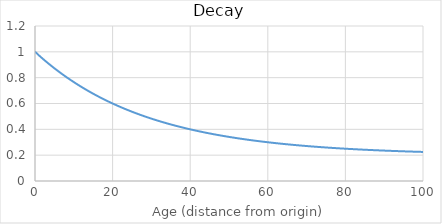
| Category | Decay |
|---|---|
| -2.0 | 1 |
| -1.0 | 1 |
| 0.0 | 1 |
| 1.0 | 0.973 |
| 2.0 | 0.946 |
| 3.0 | 0.921 |
| 4.0 | 0.896 |
| 5.0 | 0.873 |
| 6.0 | 0.85 |
| 7.0 | 0.828 |
| 8.0 | 0.806 |
| 9.0 | 0.786 |
| 10.0 | 0.766 |
| 11.0 | 0.746 |
| 12.0 | 0.728 |
| 13.0 | 0.71 |
| 14.0 | 0.692 |
| 15.0 | 0.676 |
| 16.0 | 0.659 |
| 17.0 | 0.644 |
| 18.0 | 0.629 |
| 19.0 | 0.614 |
| 20.0 | 0.6 |
| 21.0 | 0.586 |
| 22.0 | 0.573 |
| 23.0 | 0.561 |
| 24.0 | 0.548 |
| 25.0 | 0.536 |
| 26.0 | 0.525 |
| 27.0 | 0.514 |
| 28.0 | 0.503 |
| 29.0 | 0.493 |
| 30.0 | 0.483 |
| 31.0 | 0.473 |
| 32.0 | 0.464 |
| 33.0 | 0.455 |
| 34.0 | 0.446 |
| 35.0 | 0.438 |
| 36.0 | 0.43 |
| 37.0 | 0.422 |
| 38.0 | 0.414 |
| 39.0 | 0.407 |
| 40.0 | 0.4 |
| 41.0 | 0.393 |
| 42.0 | 0.387 |
| 43.0 | 0.38 |
| 44.0 | 0.374 |
| 45.0 | 0.368 |
| 46.0 | 0.362 |
| 47.0 | 0.357 |
| 48.0 | 0.352 |
| 49.0 | 0.346 |
| 50.0 | 0.341 |
| 51.0 | 0.337 |
| 52.0 | 0.332 |
| 53.0 | 0.327 |
| 54.0 | 0.323 |
| 55.0 | 0.319 |
| 56.0 | 0.315 |
| 57.0 | 0.311 |
| 58.0 | 0.307 |
| 59.0 | 0.304 |
| 60.0 | 0.3 |
| 61.0 | 0.297 |
| 62.0 | 0.293 |
| 63.0 | 0.29 |
| 64.0 | 0.287 |
| 65.0 | 0.284 |
| 66.0 | 0.281 |
| 67.0 | 0.278 |
| 68.0 | 0.276 |
| 69.0 | 0.273 |
| 70.0 | 0.271 |
| 71.0 | 0.268 |
| 72.0 | 0.266 |
| 73.0 | 0.264 |
| 74.0 | 0.262 |
| 75.0 | 0.259 |
| 76.0 | 0.257 |
| 77.0 | 0.255 |
| 78.0 | 0.254 |
| 79.0 | 0.252 |
| 80.0 | 0.25 |
| 81.0 | 0.248 |
| 82.0 | 0.247 |
| 83.0 | 0.245 |
| 84.0 | 0.244 |
| 85.0 | 0.242 |
| 86.0 | 0.241 |
| 87.0 | 0.239 |
| 88.0 | 0.238 |
| 89.0 | 0.237 |
| 90.0 | 0.235 |
| 91.0 | 0.234 |
| 92.0 | 0.233 |
| 93.0 | 0.232 |
| 94.0 | 0.231 |
| 95.0 | 0.23 |
| 96.0 | 0.229 |
| 97.0 | 0.228 |
| 98.0 | 0.227 |
| 99.0 | 0.226 |
| 100.0 | 0.225 |